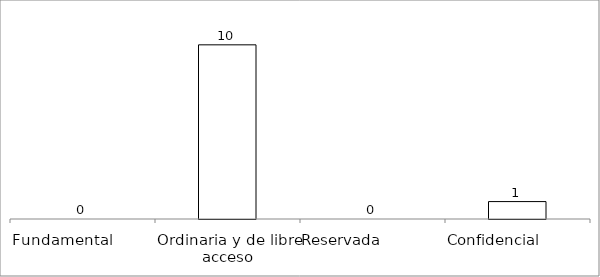
| Category | Series 0 |
|---|---|
| Fundamental         | 0 |
| Ordinaria y de libre acceso | 10 |
| Reservada               | 0 |
| Confidencial             | 1 |